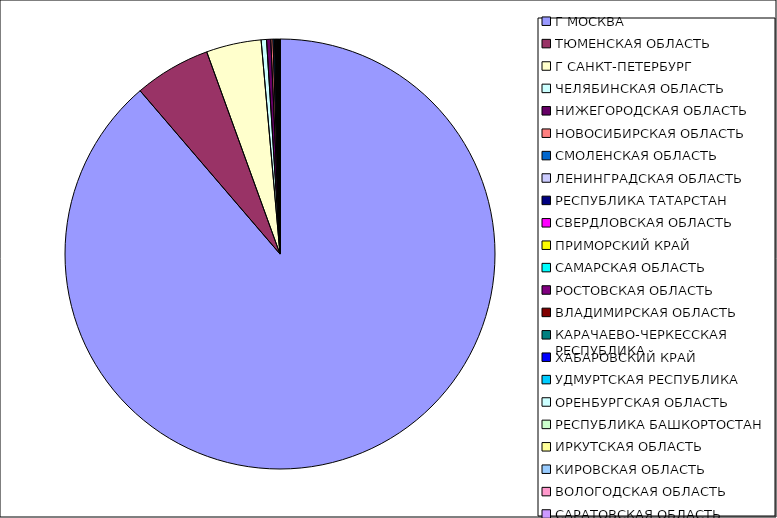
| Category | Оборот |
|---|---|
| Г МОСКВА | 0.887 |
| ТЮМЕНСКАЯ ОБЛАСТЬ | 0.057 |
| Г САНКТ-ПЕТЕРБУРГ | 0.041 |
| ЧЕЛЯБИНСКАЯ ОБЛАСТЬ | 0.004 |
| НИЖЕГОРОДСКАЯ ОБЛАСТЬ | 0.003 |
| НОВОСИБИРСКАЯ ОБЛАСТЬ | 0.002 |
| СМОЛЕНСКАЯ ОБЛАСТЬ | 0.001 |
| ЛЕНИНГРАДСКАЯ ОБЛАСТЬ | 0.001 |
| РЕСПУБЛИКА ТАТАРСТАН | 0.001 |
| СВЕРДЛОВСКАЯ ОБЛАСТЬ | 0 |
| ПРИМОРСКИЙ КРАЙ | 0 |
| САМАРСКАЯ ОБЛАСТЬ | 0 |
| РОСТОВСКАЯ ОБЛАСТЬ | 0 |
| ВЛАДИМИРСКАЯ ОБЛАСТЬ | 0 |
| КАРАЧАЕВО-ЧЕРКЕССКАЯ РЕСПУБЛИКА | 0 |
| ХАБАРОВСКИЙ КРАЙ | 0 |
| УДМУРТСКАЯ РЕСПУБЛИКА | 0 |
| ОРЕНБУРГСКАЯ ОБЛАСТЬ | 0 |
| РЕСПУБЛИКА БАШКОРТОСТАН | 0 |
| ИРКУТСКАЯ ОБЛАСТЬ | 0 |
| КИРОВСКАЯ ОБЛАСТЬ | 0 |
| ВОЛОГОДСКАЯ ОБЛАСТЬ | 0 |
| САРАТОВСКАЯ ОБЛАСТЬ | 0 |
| ВОРОНЕЖСКАЯ ОБЛАСТЬ | 0 |
| КАЛУЖСКАЯ ОБЛАСТЬ | 0 |
| РЕСПУБЛИКА ДАГЕСТАН | 0 |
| КРАСНОДАРСКИЙ КРАЙ | 0 |